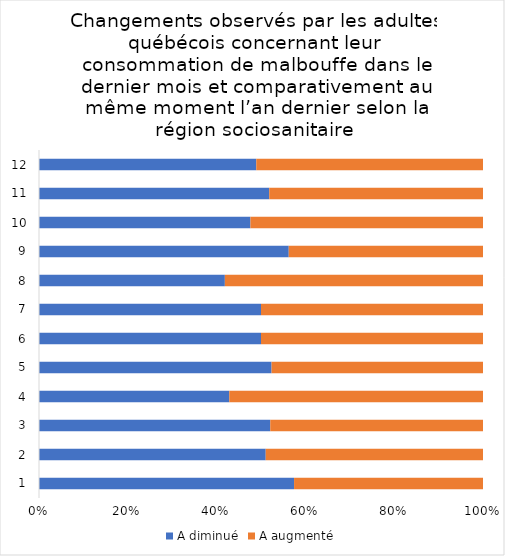
| Category | A diminué | A augmenté |
|---|---|---|
| 0 | 27 | 20 |
| 1 | 24 | 23 |
| 2 | 25 | 23 |
| 3 | 18 | 24 |
| 4 | 22 | 20 |
| 5 | 26 | 26 |
| 6 | 25 | 25 |
| 7 | 18 | 25 |
| 8 | 27 | 21 |
| 9 | 20 | 22 |
| 10 | 28 | 26 |
| 11 | 23 | 24 |